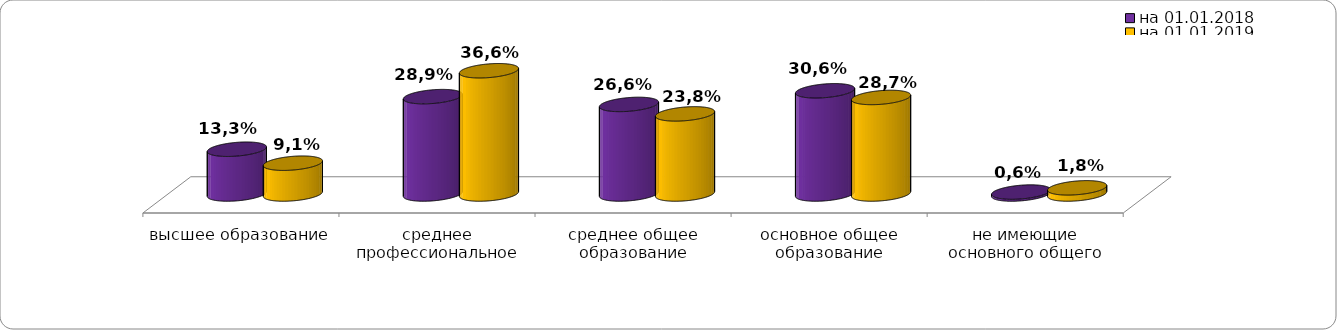
| Category | на 01.01.2018 | на 01.01.2019  |
|---|---|---|
| высшее образование | 0.133 | 0.091 |
| среднее профессиональное образование | 0.289 | 0.366 |
| среднее общее образование | 0.266 | 0.238 |
| основное общее образование | 0.306 | 0.287 |
| не имеющие основного общего образования | 0.006 | 0.018 |